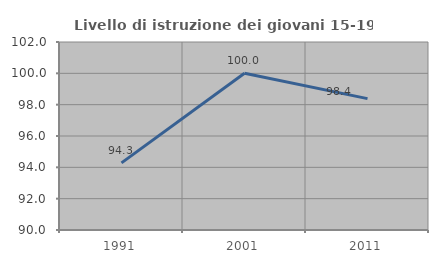
| Category | Livello di istruzione dei giovani 15-19 anni |
|---|---|
| 1991.0 | 94.286 |
| 2001.0 | 100 |
| 2011.0 | 98.387 |